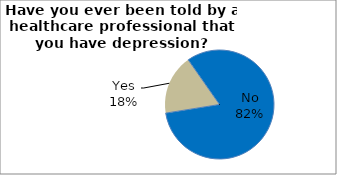
| Category | Series 0 |
|---|---|
| No | 82.19 |
| Yes | 17.81 |